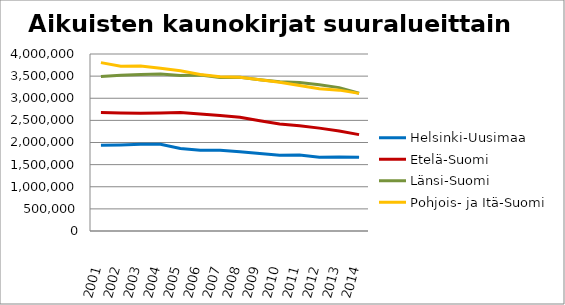
| Category | Helsinki-Uusimaa | Etelä-Suomi | Länsi-Suomi | Pohjois- ja Itä-Suomi |
|---|---|---|---|---|
| 2001.0 | 1935692 | 2675170 | 3488824 | 3804955 |
| 2002.0 | 1942885 | 2666846 | 3517370 | 3725376 |
| 2003.0 | 1959133 | 2659866 | 3538627 | 3727461 |
| 2004.0 | 1961510 | 2665206 | 3549269 | 3678468 |
| 2005.0 | 1866147 | 2677014 | 3515511 | 3619518 |
| 2006.0 | 1827132 | 2643103 | 3522986 | 3537579 |
| 2007.0 | 1824510 | 2608646 | 3469473 | 3486521 |
| 2008.0 | 1793397 | 2569986 | 3476709 | 3473178 |
| 2009.0 | 1752014 | 2490330 | 3420568 | 3416380 |
| 2010.0 | 1712191 | 2418007 | 3371962 | 3363501 |
| 2011.0 | 1716098 | 2380493 | 3354310 | 3289402 |
| 2012.0 | 1667054 | 2324914 | 3304335 | 3217292 |
| 2013.0 | 1675012 | 2258200 | 3240556 | 3183288 |
| 2014.0 | 1663918 | 2178150 | 3111705 | 3110454 |